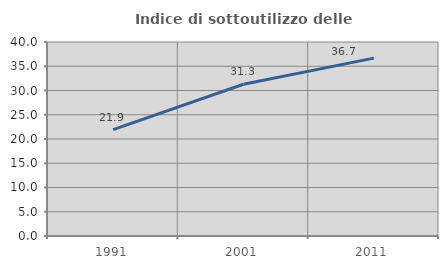
| Category | Indice di sottoutilizzo delle abitazioni  |
|---|---|
| 1991.0 | 21.935 |
| 2001.0 | 31.286 |
| 2011.0 | 36.672 |